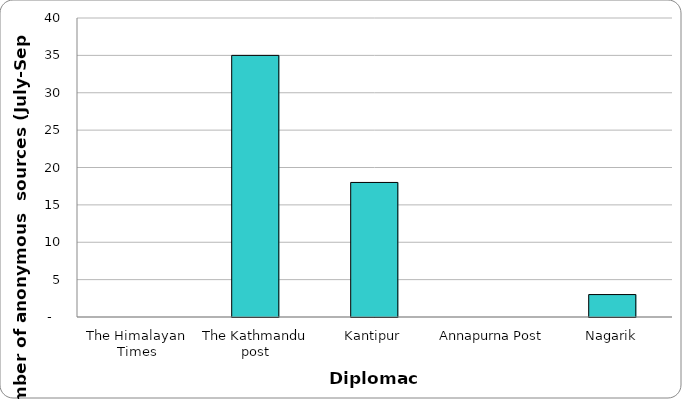
| Category | Diplomacy |
|---|---|
| The Himalayan Times | 0 |
| The Kathmandu post | 35 |
| Kantipur | 18 |
| Annapurna Post | 0 |
| Nagarik | 3 |